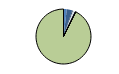
| Category | Series 0 |
|---|---|
| ARRASTRE | 14 |
| CERCO | 23 |
| ATUNEROS CAÑEROS | 4 |
| PALANGRE DE FONDO | 10 |
| PALANGRE DE SUPERFICIE | 1 |
| RASCO | 0 |
| VOLANTA | 0 |
| ARTES FIJAS | 1 |
| ARTES MENORES | 669 |